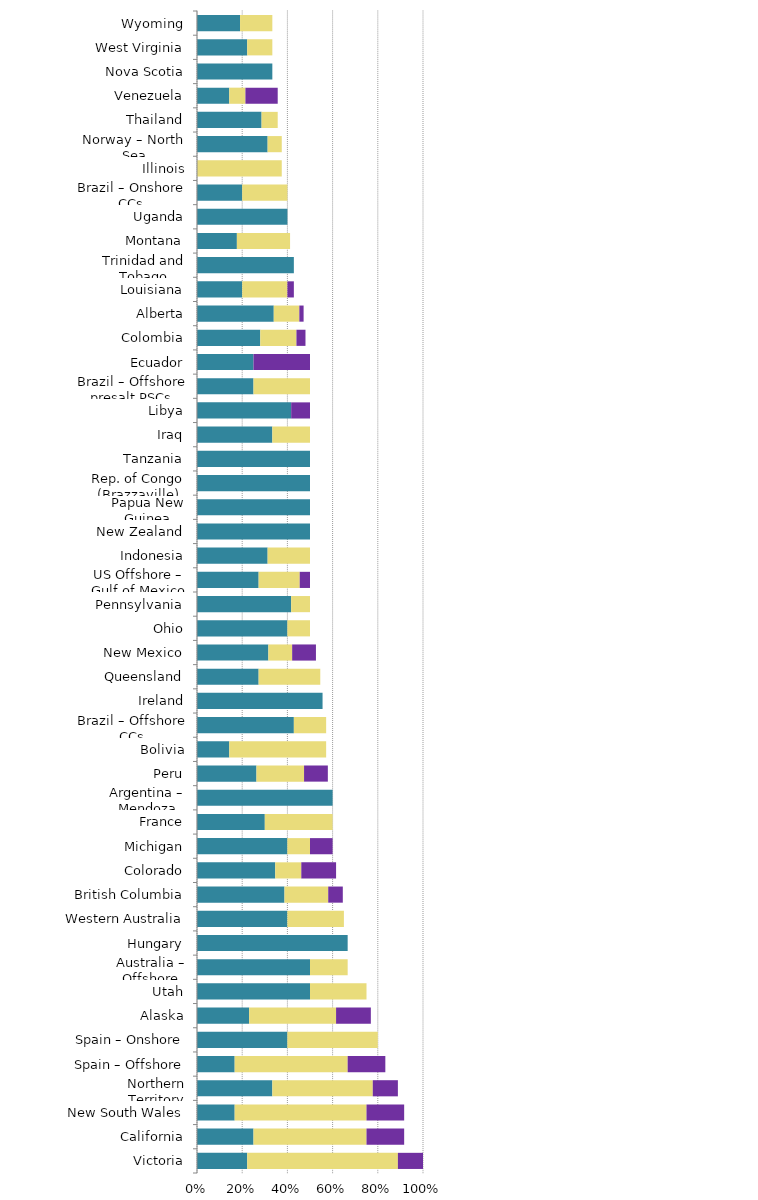
| Category | Mild deterrent to investment | Strong deterrent to investment | Would not pursue investment due to this factor |
|---|---|---|---|
| Victoria | 0.222 | 0.667 | 0.111 |
| California | 0.25 | 0.5 | 0.167 |
| New South Wales | 0.167 | 0.583 | 0.167 |
| Northern Territory | 0.333 | 0.444 | 0.111 |
| Spain – Offshore | 0.167 | 0.5 | 0.167 |
| Spain – Onshore | 0.4 | 0.4 | 0 |
| Alaska | 0.231 | 0.385 | 0.154 |
| Utah | 0.5 | 0.25 | 0 |
| Australia – Offshore | 0.5 | 0.167 | 0 |
| Hungary | 0.667 | 0 | 0 |
| Western Australia | 0.4 | 0.25 | 0 |
| British Columbia | 0.387 | 0.194 | 0.065 |
| Colorado | 0.346 | 0.115 | 0.154 |
| Michigan | 0.4 | 0.1 | 0.1 |
| France | 0.3 | 0.3 | 0 |
| Argentina – Mendoza | 0.6 | 0 | 0 |
| Peru | 0.263 | 0.211 | 0.105 |
| Bolivia | 0.143 | 0.429 | 0 |
| Brazil – Offshore CCs | 0.429 | 0.143 | 0 |
| Ireland | 0.556 | 0 | 0 |
| Queensland | 0.273 | 0.273 | 0 |
| New Mexico | 0.316 | 0.105 | 0.105 |
| Ohio | 0.4 | 0.1 | 0 |
| Pennsylvania | 0.417 | 0.083 | 0 |
| US Offshore – Gulf of Mexico | 0.273 | 0.182 | 0.045 |
| Indonesia | 0.312 | 0.188 | 0 |
| New Zealand | 0.5 | 0 | 0 |
| Papua New Guinea | 0.5 | 0 | 0 |
| Rep. of Congo (Brazzaville) | 0.5 | 0 | 0 |
| Tanzania | 0.5 | 0 | 0 |
| Iraq | 0.333 | 0.167 | 0 |
| Libya | 0.417 | 0 | 0.083 |
| Brazil – Offshore presalt PSCs | 0.25 | 0.25 | 0 |
| Ecuador | 0.25 | 0 | 0.25 |
| Colombia | 0.28 | 0.16 | 0.04 |
| Alberta | 0.34 | 0.113 | 0.019 |
| Louisiana | 0.2 | 0.2 | 0.029 |
| Trinidad and Tobago | 0.429 | 0 | 0 |
| Montana | 0.176 | 0.235 | 0 |
| Uganda | 0.4 | 0 | 0 |
| Brazil – Onshore CCs | 0.2 | 0.2 | 0 |
| Illinois | 0 | 0.375 | 0 |
| Norway – North Sea | 0.312 | 0.062 | 0 |
| Thailand | 0.286 | 0.071 | 0 |
| Venezuela | 0.143 | 0.071 | 0.143 |
| Nova Scotia | 0.333 | 0 | 0 |
| West Virginia | 0.222 | 0.111 | 0 |
| Wyoming | 0.19 | 0.143 | 0 |